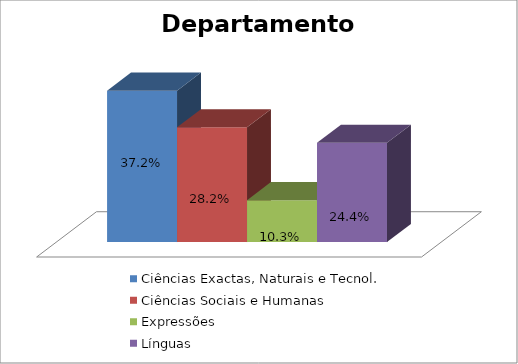
| Category | Ciências Exactas, Naturais e Tecnol. | Ciências Sociais e Humanas | Expressões | Línguas |
|---|---|---|---|---|
| 0 | 0.372 | 0.282 | 0.103 | 0.244 |